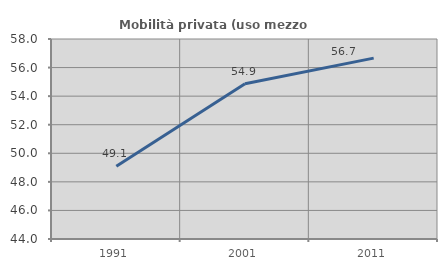
| Category | Mobilità privata (uso mezzo privato) |
|---|---|
| 1991.0 | 49.085 |
| 2001.0 | 54.864 |
| 2011.0 | 56.662 |